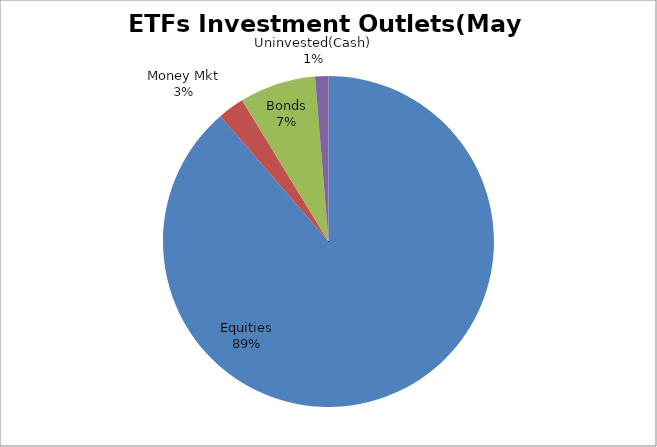
| Category | Series 0 |
|---|---|
| Equities | 5604937403.21 |
| Money Mkt | 163325823.53 |
| Bonds | 470433442.99 |
| Uninvested(Cash) | 82279078.28 |